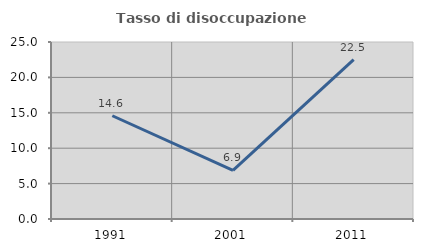
| Category | Tasso di disoccupazione giovanile  |
|---|---|
| 1991.0 | 14.583 |
| 2001.0 | 6.857 |
| 2011.0 | 22.5 |